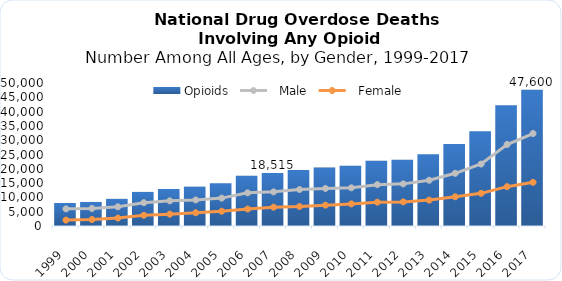
| Category | Opioids |
|---|---|
| 1999.0 | 8048 |
| 2000.0 | 8407 |
| 2001.0 | 9492 |
| 2002.0 | 11917 |
| 2003.0 | 12939 |
| 2004.0 | 13755 |
| 2005.0 | 14917 |
| 2006.0 | 17545 |
| 2007.0 | 18515 |
| 2008.0 | 19582 |
| 2009.0 | 20422 |
| 2010.0 | 21088 |
| 2011.0 | 22784 |
| 2012.0 | 23164 |
| 2013.0 | 25050 |
| 2014.0 | 28647 |
| 2015.0 | 33091 |
| 2016.0 | 42249 |
| 2017.0 | 47600 |